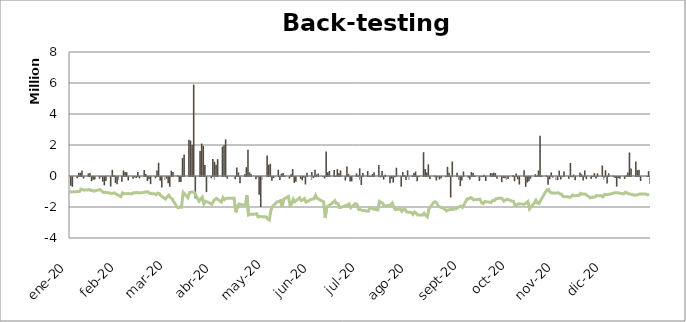
| Category | P&L REAL |
|---|---|
| 2020-01-02 | -570587.82 |
| 2020-01-03 | -630363.13 |
| 2020-01-06 | -83208.7 |
| 2020-01-07 | 201597.35 |
| 2020-01-08 | 209076.08 |
| 2020-01-09 | 353625.76 |
| 2020-01-10 | -107023.58 |
| 2020-01-13 | 158667.73 |
| 2020-01-14 | 187936.1 |
| 2020-01-15 | -266783.05 |
| 2020-01-16 | -183676.74 |
| 2020-01-17 | -161411.59 |
| 2020-01-20 | -109527.76 |
| 2020-01-21 | -6851.41 |
| 2020-01-22 | -300833.48 |
| 2020-01-23 | -541840.01 |
| 2020-01-24 | -260611.62 |
| 2020-01-27 | -616105.84 |
| 2020-01-28 | 399459.08 |
| 2020-01-29 | 47464.54 |
| 2020-01-30 | -384153.1 |
| 2020-01-31 | -475290.52 |
| 2020-02-03 | -309318.71 |
| 2020-02-04 | 356322.83 |
| 2020-02-05 | 251480.3 |
| 2020-02-06 | 247240.22 |
| 2020-02-07 | -223958.05 |
| 2020-02-10 | -117703.84 |
| 2020-02-11 | -21055.91 |
| 2020-02-12 | -63391.05 |
| 2020-02-13 | 264713.57 |
| 2020-02-14 | -87126.66 |
| 2020-02-17 | 382264.93 |
| 2020-02-18 | 124880.73 |
| 2020-02-19 | -263876.67 |
| 2020-02-20 | -125760.83 |
| 2020-02-21 | -458585.04 |
| 2020-02-24 | -79324.02 |
| 2020-02-25 | 362608.15 |
| 2020-02-26 | 854788.5 |
| 2020-02-27 | -248978.12 |
| 2020-02-28 | -677709.73 |
| 2020-03-02 | -106904.99 |
| 2020-03-03 | -402277.26 |
| 2020-03-04 | -633728.28 |
| 2020-03-05 | 343397.64 |
| 2020-03-06 | 259324.45 |
| 2020-03-09 | 52323.29 |
| 2020-03-10 | -329611.26 |
| 2020-03-11 | -320241.65 |
| 2020-03-12 | 1159393.04 |
| 2020-03-13 | 1380817.57 |
| 2020-03-16 | 2344993.35 |
| 2020-03-17 | 2286398.69 |
| 2020-03-18 | 1999006.63 |
| 2020-03-19 | 5896023.89 |
| 2020-03-20 | -1374763.1 |
| 2020-03-23 | 1607264.81 |
| 2020-03-24 | 2093167.2 |
| 2020-03-25 | 1939723.64 |
| 2020-03-26 | 704751.9 |
| 2020-03-27 | -974969.61 |
| 2020-03-30 | -80973.07 |
| 2020-03-31 | 1091892.11 |
| 2020-04-01 | 918059.75 |
| 2020-04-02 | 729151.31 |
| 2020-04-03 | 1089455.61 |
| 2020-04-06 | 1899038.91 |
| 2020-04-07 | 1988644.95 |
| 2020-04-08 | 2361942.82 |
| 2020-04-09 | -112562.32 |
| 2020-04-14 | -139893.61 |
| 2020-04-15 | 543178.24 |
| 2020-04-16 | 231071.5 |
| 2020-04-17 | -409091.91 |
| 2020-04-20 | 116440.68 |
| 2020-04-21 | 567936.22 |
| 2020-04-22 | 1700478.43 |
| 2020-04-23 | 236796.91 |
| 2020-04-24 | 113192.75 |
| 2020-04-27 | -138179.09 |
| 2020-04-28 | -18407.07 |
| 2020-04-29 | -1137399.96 |
| 2020-04-30 | -1934039.86 |
| 2020-05-04 | 1329430.07 |
| 2020-05-05 | 728878.42 |
| 2020-05-06 | 787585.88 |
| 2020-05-07 | -238850.23 |
| 2020-05-08 | -67069.5 |
| 2020-05-11 | 399801.9 |
| 2020-05-12 | -199902.32 |
| 2020-05-13 | 158611.69 |
| 2020-05-14 | 186572.02 |
| 2020-05-15 | 10280.59 |
| 2020-05-18 | -103589.98 |
| 2020-05-19 | 119737.01 |
| 2020-05-20 | 450216.74 |
| 2020-05-21 | -373903.64 |
| 2020-05-22 | -299156.17 |
| 2020-05-25 | -120877.28 |
| 2020-05-26 | -215357.57 |
| 2020-05-27 | -25653.32 |
| 2020-05-28 | -483648.82 |
| 2020-05-29 | 212080.6 |
| 2020-06-01 | 260684.83 |
| 2020-06-02 | -73538.6 |
| 2020-06-03 | 406856.28 |
| 2020-06-04 | 95918.74 |
| 2020-06-05 | 164279.95 |
| 2020-06-08 | -957.87 |
| 2020-06-09 | -87526.69 |
| 2020-06-10 | 1587691.92 |
| 2020-06-11 | 236563.07 |
| 2020-06-12 | 321437.7 |
| 2020-06-15 | 387653.83 |
| 2020-06-16 | 11247.38 |
| 2020-06-17 | 446890.33 |
| 2020-06-18 | 183968.13 |
| 2020-06-19 | 365513.31 |
| 2020-06-22 | -225726.12 |
| 2020-06-23 | 618005.45 |
| 2020-06-24 | 139351.8 |
| 2020-06-25 | -295774.77 |
| 2020-06-26 | -281640.14 |
| 2020-06-29 | 170212.61 |
| 2020-06-30 | 45036.27 |
| 2020-07-01 | 499177.44 |
| 2020-07-02 | -512714.85 |
| 2020-07-03 | 196521.56 |
| 2020-07-06 | 318544.07 |
| 2020-07-07 | -1509.21 |
| 2020-07-08 | -5840.79 |
| 2020-07-09 | 132013.21 |
| 2020-07-10 | 239590.87 |
| 2020-07-13 | 707281.8 |
| 2020-07-14 | -23490.17 |
| 2020-07-15 | 323294.59 |
| 2020-07-16 | -171267.9 |
| 2020-07-17 | 84037.77 |
| 2020-07-20 | -400367.88 |
| 2020-07-21 | -104366.31 |
| 2020-07-22 | -358568.76 |
| 2020-07-23 | -8132.42 |
| 2020-07-24 | 533943.84 |
| 2020-07-27 | -625341.98 |
| 2020-07-28 | 256307.01 |
| 2020-07-29 | 61105.37 |
| 2020-07-30 | -187194.07 |
| 2020-07-31 | 367735.52 |
| 2020-08-03 | 20217.73 |
| 2020-08-04 | 192271.87 |
| 2020-08-05 | 286596.47 |
| 2020-08-06 | -276045.22 |
| 2020-08-07 | -9726.74 |
| 2020-08-10 | 1533724.07 |
| 2020-08-11 | 445738.71 |
| 2020-08-12 | 230649.94 |
| 2020-08-13 | 753124.5 |
| 2020-08-14 | -134917.74 |
| 2020-08-17 | 29634.65 |
| 2020-08-18 | -227059.26 |
| 2020-08-19 | -15293.26 |
| 2020-08-20 | -164496.56 |
| 2020-08-21 | -75969.76 |
| 2020-08-24 | -13740.81 |
| 2020-08-25 | 592079.95 |
| 2020-08-26 | 212210.3 |
| 2020-08-27 | -1321502.89 |
| 2020-08-28 | 938316.73 |
| 2020-08-31 | 202573.43 |
| 2020-09-01 | -48587.66 |
| 2020-09-02 | -590375.68 |
| 2020-09-03 | -227160.35 |
| 2020-09-04 | 287829.91 |
| 2020-09-07 | -38483.19 |
| 2020-09-08 | -161676.71 |
| 2020-09-09 | 252173.59 |
| 2020-09-10 | 189584.73 |
| 2020-09-11 | 34301.62 |
| 2020-09-14 | -262744.39 |
| 2020-09-15 | -7108.32 |
| 2020-09-16 | -2258.66 |
| 2020-09-17 | 79307.27 |
| 2020-09-18 | -260526.21 |
| 2020-09-21 | 195443.21 |
| 2020-09-22 | 169205.94 |
| 2020-09-23 | 215500.9 |
| 2020-09-24 | 183499.14 |
| 2020-09-25 | -110622.36 |
| 2020-09-28 | -330362.08 |
| 2020-09-29 | -55324.43 |
| 2020-09-30 | -77823.29 |
| 2020-10-01 | -31908.18 |
| 2020-10-02 | -136690.24 |
| 2020-10-05 | 55081.46 |
| 2020-10-06 | -275649.35 |
| 2020-10-07 | 155072.16 |
| 2020-10-08 | -149547.6 |
| 2020-10-09 | -486477.78 |
| 2020-10-12 | 375085.57 |
| 2020-10-13 | -632238.94 |
| 2020-10-14 | -358634 |
| 2020-10-15 | -281283.72 |
| 2020-10-16 | -117512.77 |
| 2020-10-19 | 117875.7 |
| 2020-10-20 | 31497.56 |
| 2020-10-21 | 355327.68 |
| 2020-10-22 | 2597515.12 |
| 2020-10-23 | 26811.03 |
| 2020-10-26 | 43406.7 |
| 2020-10-27 | -506486.37 |
| 2020-10-28 | -150878.77 |
| 2020-10-29 | 233361.31 |
| 2020-10-30 | -29829.3 |
| 2020-11-02 | -201597.83 |
| 2020-11-03 | 347765.06 |
| 2020-11-04 | -157723.7 |
| 2020-11-05 | -4141.96 |
| 2020-11-06 | 289615.73 |
| 2020-11-09 | -119742.54 |
| 2020-11-10 | 841912.9 |
| 2020-11-11 | -18079.3 |
| 2020-11-12 | 97154.11 |
| 2020-11-13 | -204571.71 |
| 2020-11-16 | 232863.21 |
| 2020-11-17 | 112897.17 |
| 2020-11-18 | -231371.05 |
| 2020-11-19 | 362327.89 |
| 2020-11-20 | -136540.17 |
| 2020-11-23 | -125789.21 |
| 2020-11-24 | -6666.81 |
| 2020-11-25 | 188087.59 |
| 2020-11-26 | -102050.18 |
| 2020-11-27 | 168888.66 |
| 2020-11-30 | 678157.66 |
| 2020-12-01 | -51954.79 |
| 2020-12-02 | 370991.82 |
| 2020-12-03 | -417507.2 |
| 2020-12-04 | 174382.11 |
| 2020-12-07 | 31435.42 |
| 2020-12-08 | -57322.35 |
| 2020-12-09 | -620163.33 |
| 2020-12-10 | -68065.59 |
| 2020-12-11 | -109022.81 |
| 2020-12-14 | -128982.21 |
| 2020-12-15 | 57235.72 |
| 2020-12-16 | 224084.54 |
| 2020-12-17 | 1518221.88 |
| 2020-12-18 | 476120.34 |
| 2020-12-21 | 938686.62 |
| 2020-12-22 | 380329.82 |
| 2020-12-23 | 403889.49 |
| 2020-12-24 | -260092.05 |
| 2020-12-28 | -7393.46 |
| 2020-12-29 | 313641.89 |
| 2020-12-30 | -445285.89 |
| 2020-12-31 | 312119.58 |